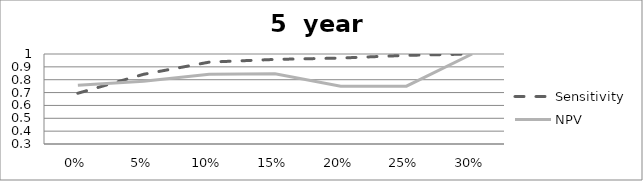
| Category | Sensitivity | NPV |
|---|---|---|
| 0.0 | 0.695 | 0.756 |
| 0.05 | 0.842 | 0.789 |
| 0.1 | 0.937 | 0.842 |
| 0.15 | 0.958 | 0.846 |
| 0.2 | 0.968 | 0.75 |
| 0.25 | 0.989 | 0.75 |
| 0.3 | 1 | 1 |